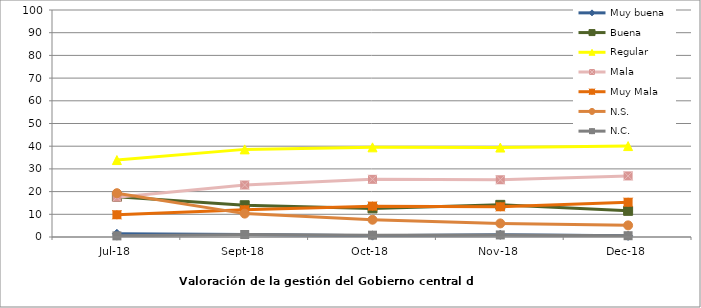
| Category | Muy buena | Buena | Regular | Mala | Muy Mala | N.S. | N.C. |
|---|---|---|---|---|---|---|---|
| 2018-07-01 | 1.4 | 17.7 | 33.9 | 17.5 | 9.8 | 19.3 | 0.5 |
| 2018-09-01 | 1.1 | 14 | 38.6 | 22.9 | 12 | 10.3 | 1.1 |
| 2018-10-01 | 0.6 | 12.6 | 39.5 | 25.4 | 13.6 | 7.6 | 0.8 |
| 2018-11-01 | 1.009 | 14.156 | 39.408 | 25.219 | 13.315 | 5.985 | 0.908 |
| 2018-12-01 | 0.503 | 11.528 | 40.047 | 26.91 | 15.315 | 5.127 | 0.57 |